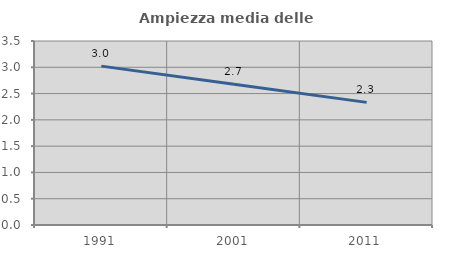
| Category | Ampiezza media delle famiglie |
|---|---|
| 1991.0 | 3.022 |
| 2001.0 | 2.675 |
| 2011.0 | 2.332 |